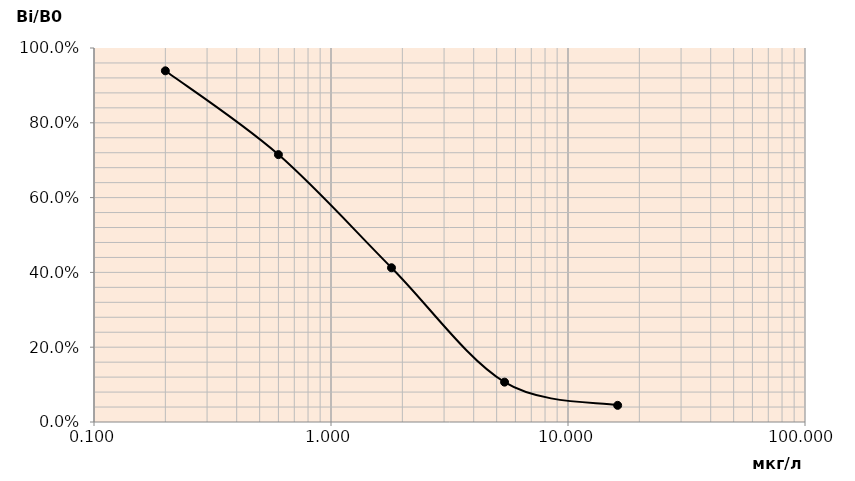
| Category | Series 0 |
|---|---|
| 0.2 | 0.939 |
| 0.6 | 0.715 |
| 1.8 | 0.412 |
| 5.4 | 0.107 |
| 16.2 | 0.045 |